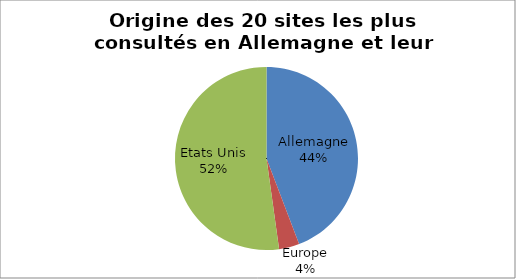
| Category | Series 0 |
|---|---|
| 0 | 0.442 |
| 1 | 0.036 |
| 2 | 0.522 |